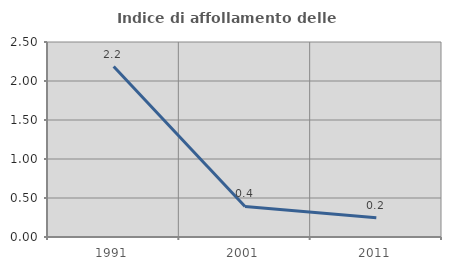
| Category | Indice di affollamento delle abitazioni  |
|---|---|
| 1991.0 | 2.186 |
| 2001.0 | 0.392 |
| 2011.0 | 0.246 |